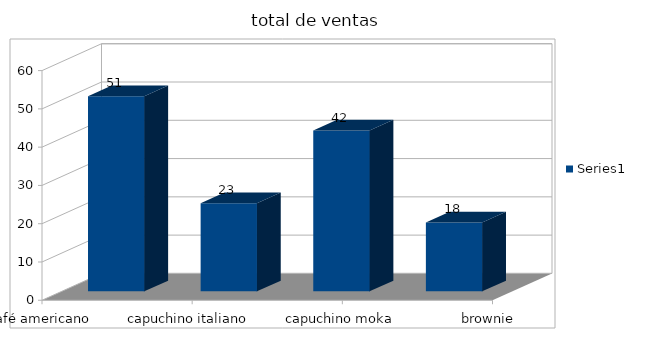
| Category | Series 0 |
|---|---|
| café americano | 51 |
| capuchino italiano  | 23 |
| capuchino moka | 42 |
| brownie  | 18 |